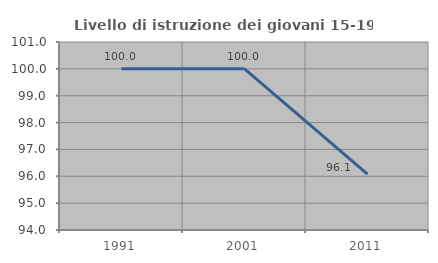
| Category | Livello di istruzione dei giovani 15-19 anni |
|---|---|
| 1991.0 | 100 |
| 2001.0 | 100 |
| 2011.0 | 96.078 |